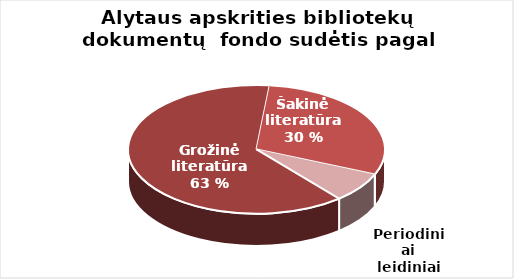
| Category | Series 0 |
|---|---|
| Grožinė literatūra* | 573405 |
| Šakinė literatūra* | 271781 |
| period. | 68634 |